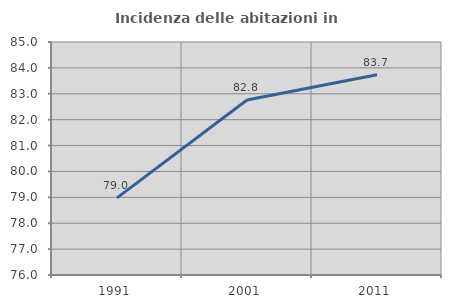
| Category | Incidenza delle abitazioni in proprietà  |
|---|---|
| 1991.0 | 78.98 |
| 2001.0 | 82.757 |
| 2011.0 | 83.738 |